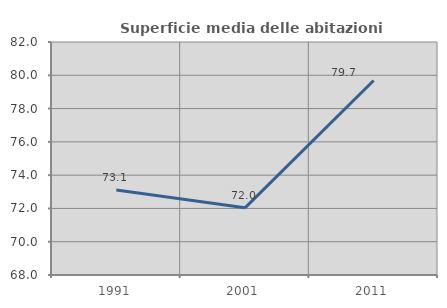
| Category | Superficie media delle abitazioni occupate |
|---|---|
| 1991.0 | 73.107 |
| 2001.0 | 72.034 |
| 2011.0 | 79.688 |